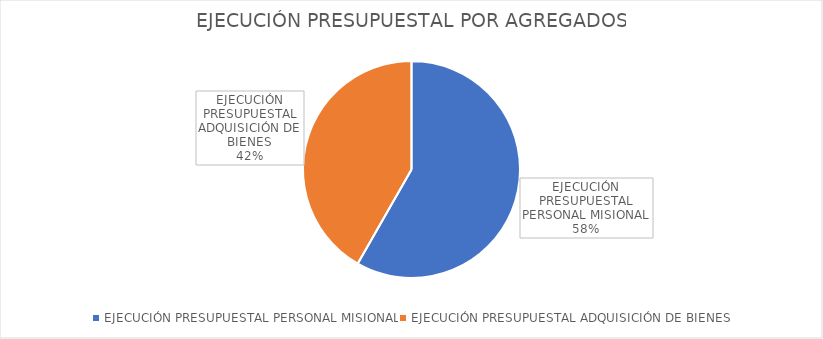
| Category | Series 0 |
|---|---|
| EJECUCIÓN PRESUPUESTAL PERSONAL MISIONAL | 0.548 |
| EJECUCIÓN PRESUPUESTAL ADQUISICIÓN DE BIENES | 0.393 |